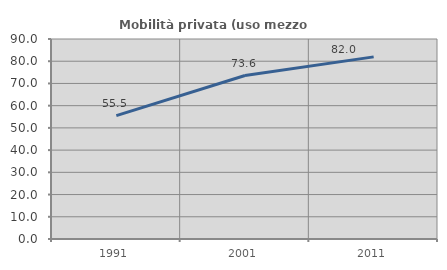
| Category | Mobilità privata (uso mezzo privato) |
|---|---|
| 1991.0 | 55.541 |
| 2001.0 | 73.563 |
| 2011.0 | 81.962 |